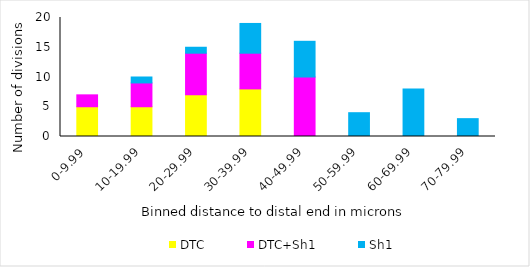
| Category | DTC | DTC+Sh1 | Sh1 |
|---|---|---|---|
| 0-9.99 | 5 | 2 | 0 |
| 10-19.99 | 5 | 4 | 1 |
| 20-29.99 | 7 | 7 | 1 |
| 30-39.99 | 8 | 6 | 5 |
| 40-49.99 | 0 | 10 | 6 |
| 50-59.99 | 0 | 0 | 4 |
| 60-69.99 | 0 | 0 | 8 |
| 70-79.99 | 0 | 0 | 3 |